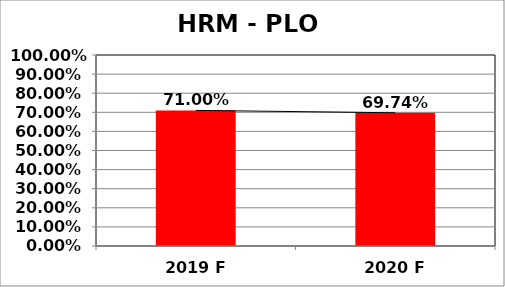
| Category | Series 0 |
|---|---|
| 2019 F | 0.71 |
| 2020 F | 0.697 |